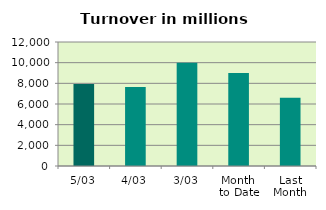
| Category | Series 0 |
|---|---|
| 5/03 | 7942.959 |
| 4/03 | 7650.55 |
| 3/03 | 9985.433 |
| Month 
to Date | 8990.055 |
| Last
Month | 6605.047 |